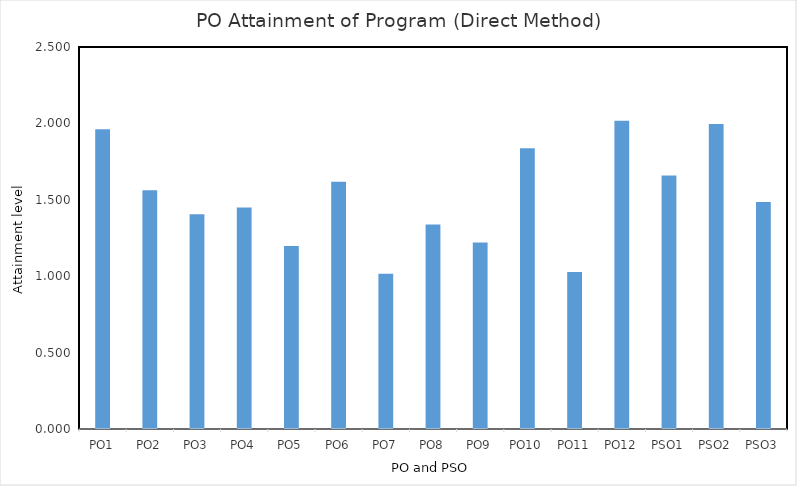
| Category | PO1 |
|---|---|
| PO1 | 1.962 |
| PO2 | 1.562 |
| PO3 | 1.406 |
| PO4 | 1.449 |
| PO5 | 1.197 |
| PO6 | 1.618 |
| PO7 | 1.016 |
| PO8 | 1.338 |
| PO9 | 1.221 |
| PO10 | 1.838 |
| PO11 | 1.027 |
| PO12 | 2.018 |
| PSO1 | 1.659 |
| PSO2 | 1.995 |
| PSO3 | 1.485 |